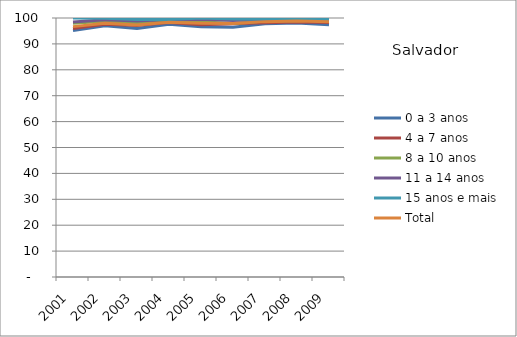
| Category | 0 a 3 anos | 4 a 7 anos | 8 a 10 anos | 11 a 14 anos | 15 anos e mais | Total |
|---|---|---|---|---|---|---|
| 2001.0 | 95.12 | 95.98 | 97.95 | 98.5 | 100 | 96.67 |
| 2002.0 | 96.96 | 97.56 | 98.75 | 99.29 | 99.86 | 98.01 |
| 2003.0 | 95.98 | 97.09 | 97.98 | 98.86 | 99.4 | 97.34 |
| 2004.0 | 97.56 | 98.22 | 98.53 | 99.44 | 99.4 | 98.4 |
| 2005.0 | 96.61 | 97.43 | 98.57 | 99.52 | 100 | 97.99 |
| 2006.0 | 96.45 | 97.81 | 97.84 | 99.05 | 99.66 | 97.85 |
| 2007.0 | 97.82 | 98.21 | 98.85 | 99.38 | 99.56 | 98.6 |
| 2008.0 | 98.05 | 98.48 | 98.96 | 99.49 | 99.79 | 98.82 |
| 2009.0 | 97.42 | 98.28 | 99.24 | 99.21 | 99.42 | 98.52 |